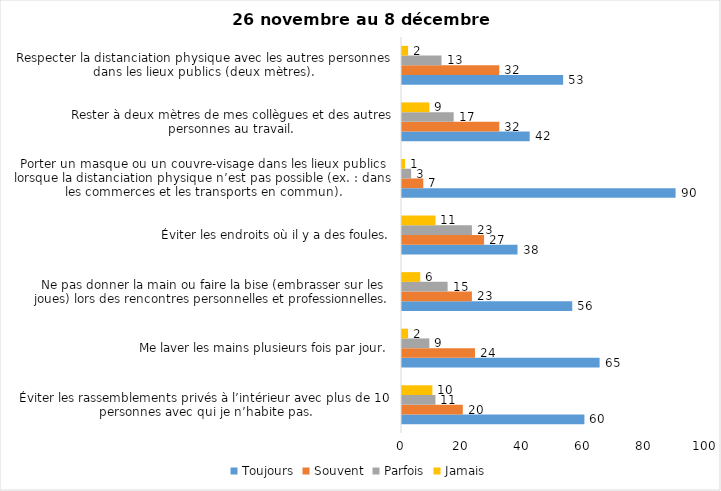
| Category | Toujours | Souvent | Parfois | Jamais |
|---|---|---|---|---|
| Éviter les rassemblements privés à l’intérieur avec plus de 10 personnes avec qui je n’habite pas. | 60 | 20 | 11 | 10 |
| Me laver les mains plusieurs fois par jour. | 65 | 24 | 9 | 2 |
| Ne pas donner la main ou faire la bise (embrasser sur les joues) lors des rencontres personnelles et professionnelles. | 56 | 23 | 15 | 6 |
| Éviter les endroits où il y a des foules. | 38 | 27 | 23 | 11 |
| Porter un masque ou un couvre-visage dans les lieux publics lorsque la distanciation physique n’est pas possible (ex. : dans les commerces et les transports en commun). | 90 | 7 | 3 | 1 |
| Rester à deux mètres de mes collègues et des autres personnes au travail. | 42 | 32 | 17 | 9 |
| Respecter la distanciation physique avec les autres personnes dans les lieux publics (deux mètres). | 53 | 32 | 13 | 2 |